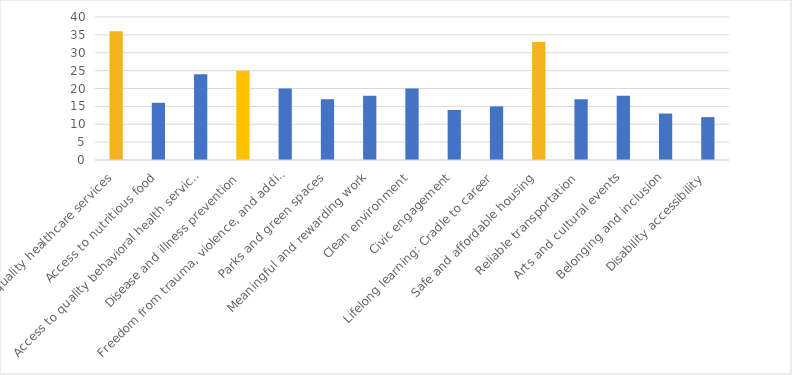
| Category | Number of Responses |
|---|---|
| Access to quality healthcare services | 36 |
| Access to nutritious food | 16 |
| Access to quality behavioral health services | 24 |
| Disease and illness prevention | 25 |
| Freedom from trauma, violence, and addiction | 20 |
| Parks and green spaces | 17 |
| Meaningful and rewarding work | 18 |
| Clean environment | 20 |
| Civic engagement | 14 |
| Lifelong learning: Cradle to career | 15 |
| Safe and affordable housing | 33 |
| Reliable transportation | 17 |
| Arts and cultural events | 18 |
| Belonging and inclusion | 13 |
| Disability accessibility | 12 |